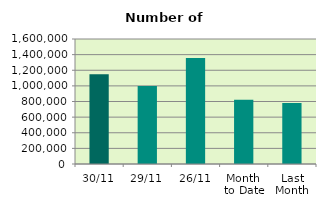
| Category | Series 0 |
|---|---|
| 30/11 | 1147918 |
| 29/11 | 996942 |
| 26/11 | 1355328 |
| Month 
to Date | 823936.455 |
| Last
Month | 780428.952 |